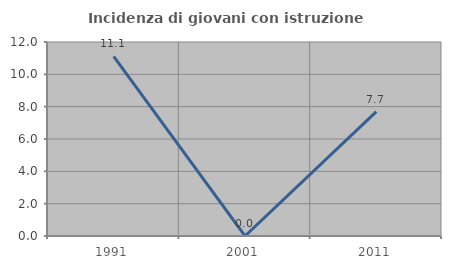
| Category | Incidenza di giovani con istruzione universitaria |
|---|---|
| 1991.0 | 11.111 |
| 2001.0 | 0 |
| 2011.0 | 7.692 |